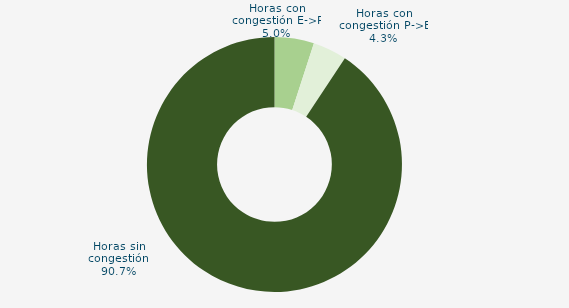
| Category | Horas con congestión E->P |
|---|---|
| Horas con congestión E->P | 5 |
| Horas con congestión P->E | 4.306 |
| Horas sin congestión | 90.694 |